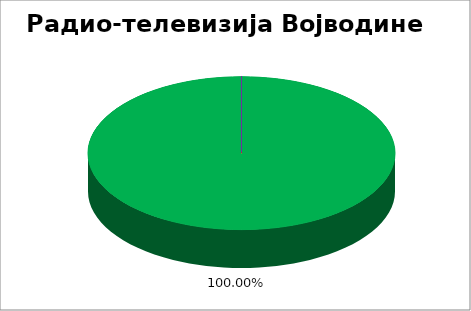
| Category | Радио-телевизија Војводине  |
|---|---|
| 0 | 1 |
| 1 | 0 |
| 2 | 0 |
| 3 | 0 |
| 4 | 0 |